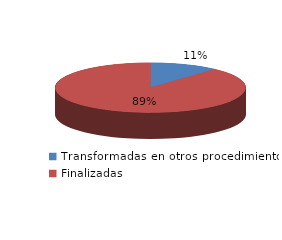
| Category | Series 0 |
|---|---|
| Transformadas en otros procedimientos | 4470 |
| Finalizadas | 34433 |